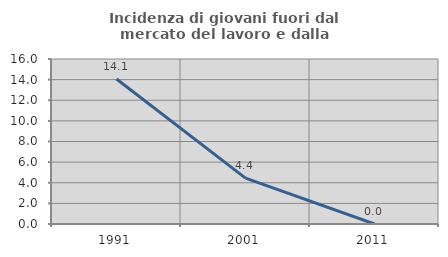
| Category | Incidenza di giovani fuori dal mercato del lavoro e dalla formazione  |
|---|---|
| 1991.0 | 14.062 |
| 2001.0 | 4.444 |
| 2011.0 | 0 |